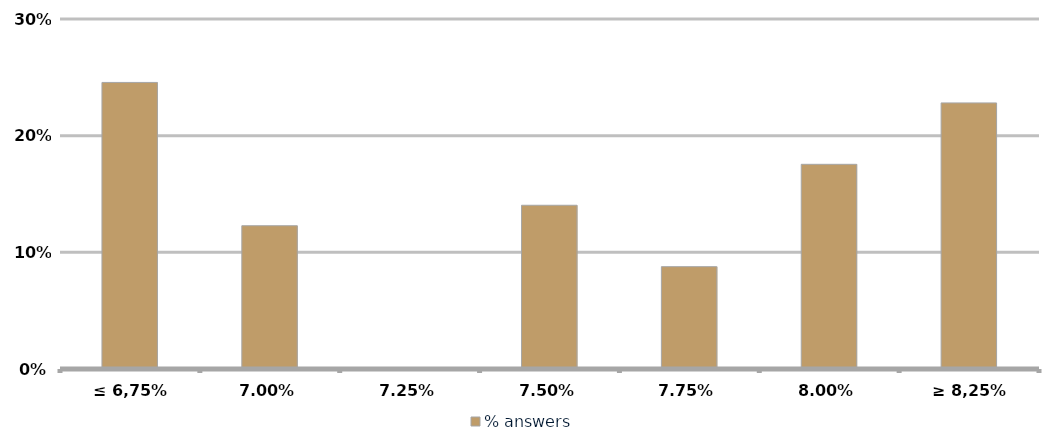
| Category | % answers |
|---|---|
| ≤ 6,75% | 0.246 |
| 7,00% | 0.123 |
| 7,25% | 0 |
| 7,50% | 0.14 |
| 7,75% | 0.088 |
| 8,00% | 0.175 |
| ≥ 8,25% | 0.228 |